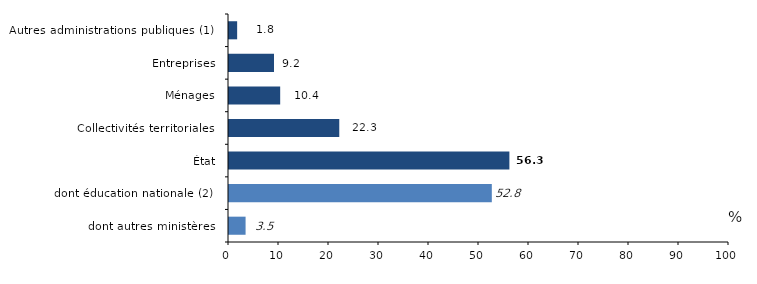
| Category | Series 0 |
|---|---|
| dont autres ministères | 3.517 |
| dont éducation nationale (2) | 52.762 |
| État | 56.279 |
| Collectivités territoriales | 22.254 |
| Ménages | 10.437 |
|  Entreprises | 9.201 |
| Autres administrations publiques (1) | 1.83 |